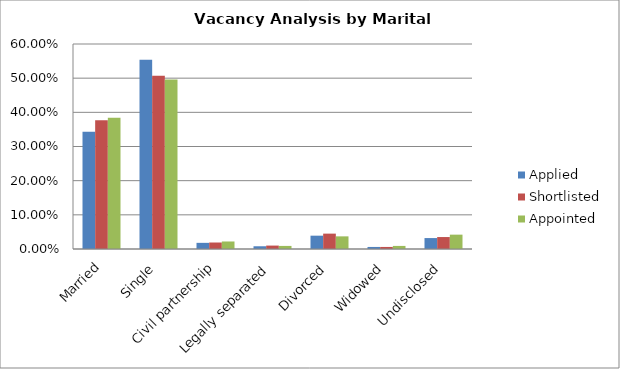
| Category | Applied | Shortlisted | Appointed |
|---|---|---|---|
| Married | 0.343 | 0.377 | 0.384 |
| Single | 0.554 | 0.507 | 0.496 |
| Civil partnership | 0.018 | 0.019 | 0.022 |
| Legally separated | 0.008 | 0.01 | 0.009 |
| Divorced | 0.039 | 0.045 | 0.037 |
| Widowed | 0.006 | 0.006 | 0.009 |
| Undisclosed | 0.032 | 0.035 | 0.042 |